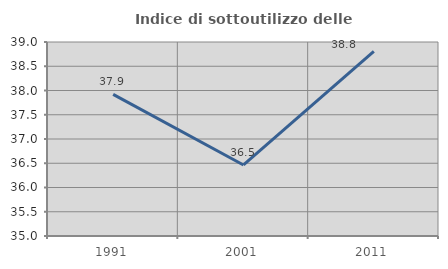
| Category | Indice di sottoutilizzo delle abitazioni  |
|---|---|
| 1991.0 | 37.919 |
| 2001.0 | 36.465 |
| 2011.0 | 38.806 |